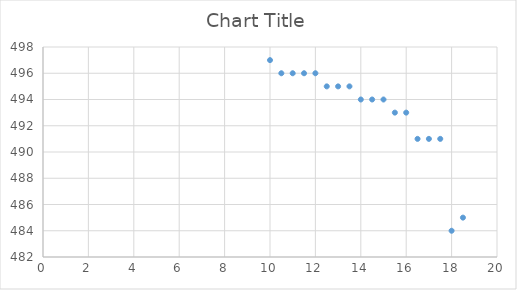
| Category | Series 0 |
|---|---|
| 18.5 | 485 |
| 18.0 | 484 |
| 17.5 | 491 |
| 17.0 | 491 |
| 16.5 | 491 |
| 16.0 | 493 |
| 15.5 | 493 |
| 15.0 | 494 |
| 14.5 | 494 |
| 14.0 | 494 |
| 13.5 | 495 |
| 13.0 | 495 |
| 12.5 | 495 |
| 12.0 | 496 |
| 11.5 | 496 |
| 11.0 | 496 |
| 10.5 | 496 |
| 10.0 | 497 |